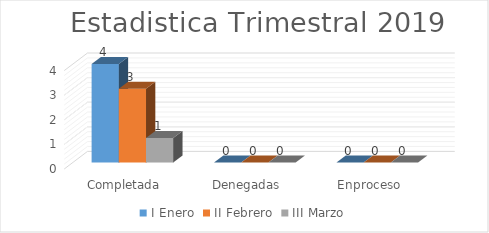
| Category | I Enero | II Febrero | III Marzo |
|---|---|---|---|
| Completada | 4 | 3 | 1 |
| Denegadas | 0 | 0 | 0 |
| Enproceso | 0 | 0 | 0 |